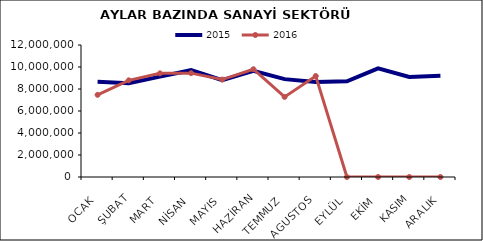
| Category | 2015 | 2016 |
|---|---|---|
| OCAK | 8662713.746 | 7469754.538 |
| ŞUBAT | 8523415.989 | 8789000.397 |
| MART | 9124946.513 | 9424984.445 |
| NİSAN | 9710571.08 | 9440525.034 |
| MAYIS | 8807318.212 | 8858531.028 |
| HAZİRAN | 9651275.972 | 9797950.874 |
| TEMMUZ | 8897089.029 | 7281236.716 |
| AGUSTOS | 8629032.021 | 9177631.074 |
| EYLÜL | 8694442.989 | 0 |
| EKİM | 9872143.239 | 0 |
| KASIM | 9096902.553 | 0 |
| ARALIK | 9208736.334 | 0 |